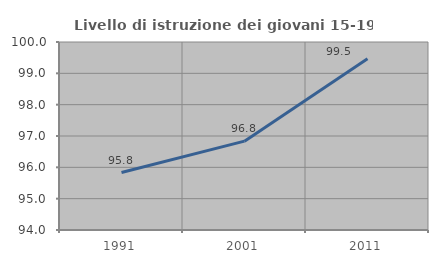
| Category | Livello di istruzione dei giovani 15-19 anni |
|---|---|
| 1991.0 | 95.833 |
| 2001.0 | 96.835 |
| 2011.0 | 99.465 |